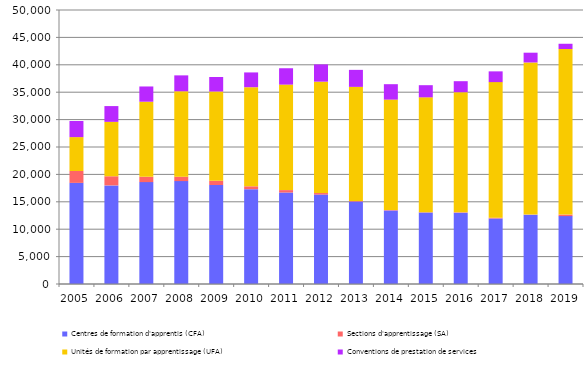
| Category | Centres de formation d'apprentis (CFA) | Sections d'apprentissage (SA) | Unités de formation par apprentissage (UFA) | Conventions de prestation de services |
|---|---|---|---|---|
| 2005.0 | 18455 | 2161 | 6188 | 2936 |
| 2006.0 | 17995 | 1665 | 9928 | 2880 |
| 2007.0 | 18591 | 970 | 13702 | 2782 |
| 2008.0 | 18779 | 805 | 15585 | 2902 |
| 2009.0 | 18062 | 782 | 16283 | 2645 |
| 2010.0 | 17304 | 526 | 18083 | 2695 |
| 2011.0 | 16694 | 439 | 19253 | 2985 |
| 2012.0 | 16323 | 276 | 20323 | 3150 |
| 2013.0 | 15050 | 108 | 20814 | 3103 |
| 2014.0 | 13425 | 78 | 20145 | 2814 |
| 2015.0 | 13046 | 47 | 20970 | 2216 |
| 2016.0 | 13022 | 75 | 21904 | 2009 |
| 2017.0 | 11961 | 129 | 24749 | 1964 |
| 2018.0 | 12653 | 22 | 27752 | 1782 |
| 2019.0 | 12387 | 283 | 30214 | 955 |